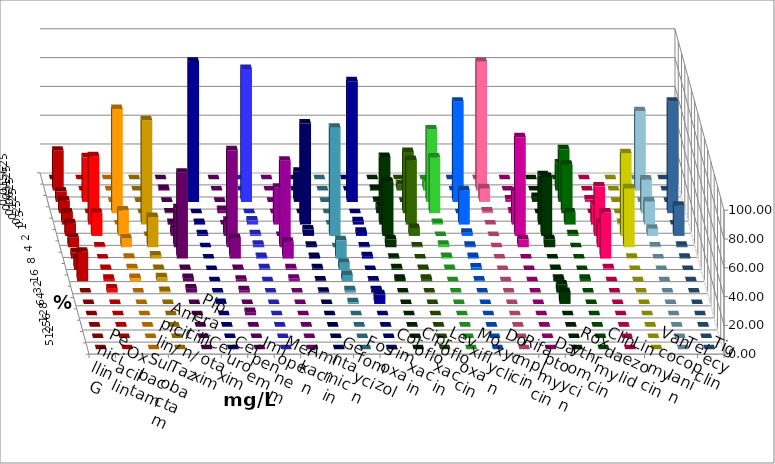
| Category | Penicillin G | Oxacillin | Ampicillin/ Sulbactam | Piperacillin/ Tazobactam | Cefotaxim | Cefuroxim | Imipenem | Meropenem | Amikacin | Gentamicin | Fosfomycin | Cotrimoxazol | Ciprofloxacin | Levofloxacin | Moxifloxacin | Doxycyclin | Rifampicin | Daptomycin | Roxythromycin | Clindamycin | Linezolid | Vancomycin | Teicoplanin | Tigecyclin |
|---|---|---|---|---|---|---|---|---|---|---|---|---|---|---|---|---|---|---|---|---|---|---|---|---|
| 0.015625 | 0 | 0 | 0 | 0 | 0 | 0 | 0 | 0 | 0 | 0 | 0 | 0 | 0 | 0 | 0 | 0 | 0 | 0 | 0 | 0 | 0 | 0 | 0 | 0 |
| 0.03125 | 27.624 | 0 | 0 | 0 | 1.105 | 0 | 0 | 0 | 0 | 0 | 0 | 0 | 1.105 | 4.42 | 6.63 | 0 | 89.503 | 0 | 0 | 18.785 | 0 | 0 | 0 | 55 |
| 0.0625 | 7.182 | 30.939 | 0 | 0 | 0 | 0 | 97.238 | 92.222 | 0 | 20.994 | 0 | 83.799 | 0.552 | 0 | 50.276 | 69.613 | 9.392 | 1.657 | 3.315 | 36.464 | 1.657 | 0 | 0 | 0 |
| 0.125 | 8.84 | 0 | 72.376 | 0 | 0.552 | 2.21 | 0 | 0 | 0 | 0 | 0 | 0 | 4.972 | 42.541 | 38.674 | 0 | 1.105 | 1.105 | 0 | 33.702 | 0 | 0 | 77.348 | 23.333 |
| 0.25 | 8.287 | 47.514 | 0 | 72.376 | 1.105 | 0 | 1.105 | 2.778 | 25.556 | 70.166 | 0 | 2.235 | 46.961 | 44.751 | 1.105 | 23.757 | 0 | 23.204 | 34.254 | 8.287 | 13.812 | 1.105 | 0 | 16.111 |
| 0.5 | 8.84 | 16.022 | 17.68 | 0 | 4.972 | 10.497 | 1.105 | 1.111 | 0 | 4.42 | 75.138 | 2.793 | 37.569 | 5.525 | 0 | 2.21 | 0 | 68.508 | 40.884 | 1.105 | 34.254 | 57.459 | 20.994 | 5 |
| 1.0 | 6.63 | 0.552 | 6.077 | 20.994 | 27.072 | 67.403 | 0 | 1.667 | 60 | 1.105 | 0 | 0.559 | 5.525 | 0.552 | 1.657 | 1.105 | 0 | 5.525 | 5.525 | 0 | 17.127 | 40.884 | 1.105 | 0.556 |
| 2.0 | 4.42 | 0 | 0.552 | 2.21 | 59.669 | 14.365 | 0 | 1.111 | 11.667 | 1.105 | 12.707 | 1.676 | 0.552 | 0 | 1.105 | 1.105 | 0 | 0 | 0 | 0 | 32.044 | 0.552 | 0.552 | 0 |
| 4.0 | 7.735 | 0.552 | 1.105 | 0.552 | 0.552 | 0.552 | 0 | 1.111 | 1.111 | 1.105 | 4.972 | 0 | 1.105 | 0.552 | 0.552 | 1.657 | 0 | 0 | 0.552 | 0 | 1.105 | 0 | 0 | 0 |
| 8.0 | 20.442 | 1.657 | 2.21 | 2.762 | 2.21 | 1.105 | 0 | 0 | 1.667 | 0.552 | 4.42 | 0.559 | 1.657 | 1.657 | 0 | 0.552 | 0 | 0 | 1.657 | 1.657 | 0 | 0 | 0 | 0 |
| 16.0 | 0 | 2.762 | 0 | 1.105 | 2.762 | 1.657 | 0 | 0 | 0 | 0.552 | 1.657 | 1.676 | 0 | 0 | 0 | 0 | 0 | 0 | 5.525 | 0 | 0 | 0 | 0 | 0 |
| 32.0 | 0 | 0 | 0 | 0 | 0 | 0 | 0.552 | 0 | 0 | 0 | 1.105 | 6.704 | 0 | 0 | 0 | 0 | 0 | 0 | 8.287 | 0 | 0 | 0 | 0 | 0 |
| 64.0 | 0 | 0 | 0 | 0 | 0 | 2.21 | 0 | 0 | 0 | 0 | 0 | 0 | 0 | 0 | 0 | 0 | 0 | 0 | 0 | 0 | 0 | 0 | 0 | 0 |
| 128.0 | 0 | 0 | 0 | 0 | 0 | 0 | 0 | 0 | 0 | 0 | 0 | 0 | 0 | 0 | 0 | 0 | 0 | 0 | 0 | 0 | 0 | 0 | 0 | 0 |
| 256.0 | 0 | 0 | 0 | 0 | 0 | 0 | 0 | 0 | 0 | 0 | 0 | 0 | 0 | 0 | 0 | 0 | 0 | 0 | 0 | 0 | 0 | 0 | 0 | 0 |
| 512.0 | 0 | 0 | 0 | 0 | 0 | 0 | 0 | 0 | 0 | 0 | 0 | 0 | 0 | 0 | 0 | 0 | 0 | 0 | 0 | 0 | 0 | 0 | 0 | 0 |